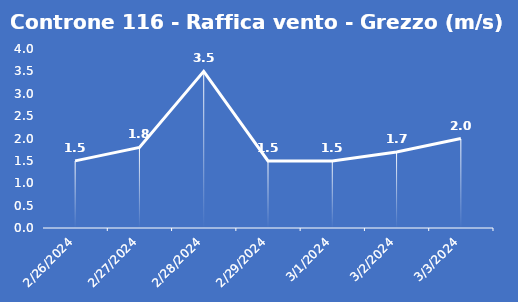
| Category | Controne 116 - Raffica vento - Grezzo (m/s) |
|---|---|
| 2/26/24 | 1.5 |
| 2/27/24 | 1.8 |
| 2/28/24 | 3.5 |
| 2/29/24 | 1.5 |
| 3/1/24 | 1.5 |
| 3/2/24 | 1.7 |
| 3/3/24 | 2 |